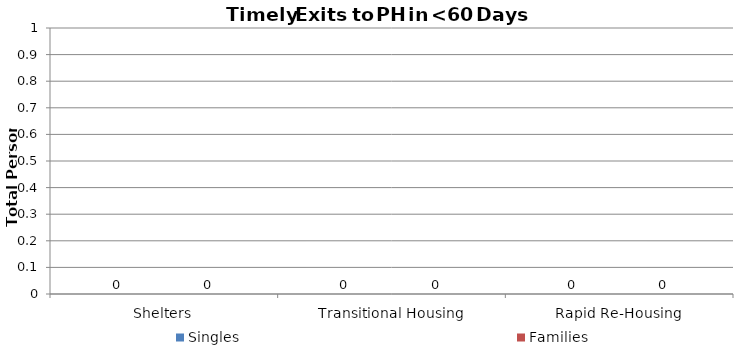
| Category | Singles | Families |
|---|---|---|
| Shelters | 0 | 0 |
| Transitional Housing | 0 | 0 |
| Rapid Re-Housing | 0 | 0 |